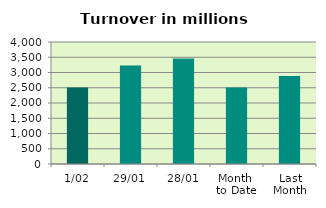
| Category | Series 0 |
|---|---|
| 1/02 | 2507.238 |
| 29/01 | 3225.714 |
| 28/01 | 3458.019 |
| Month 
to Date | 2507.238 |
| Last
Month | 2888.221 |